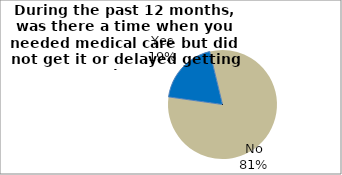
| Category | Series 0 |
|---|---|
| Yes | 19.006 |
| No | 80.994 |